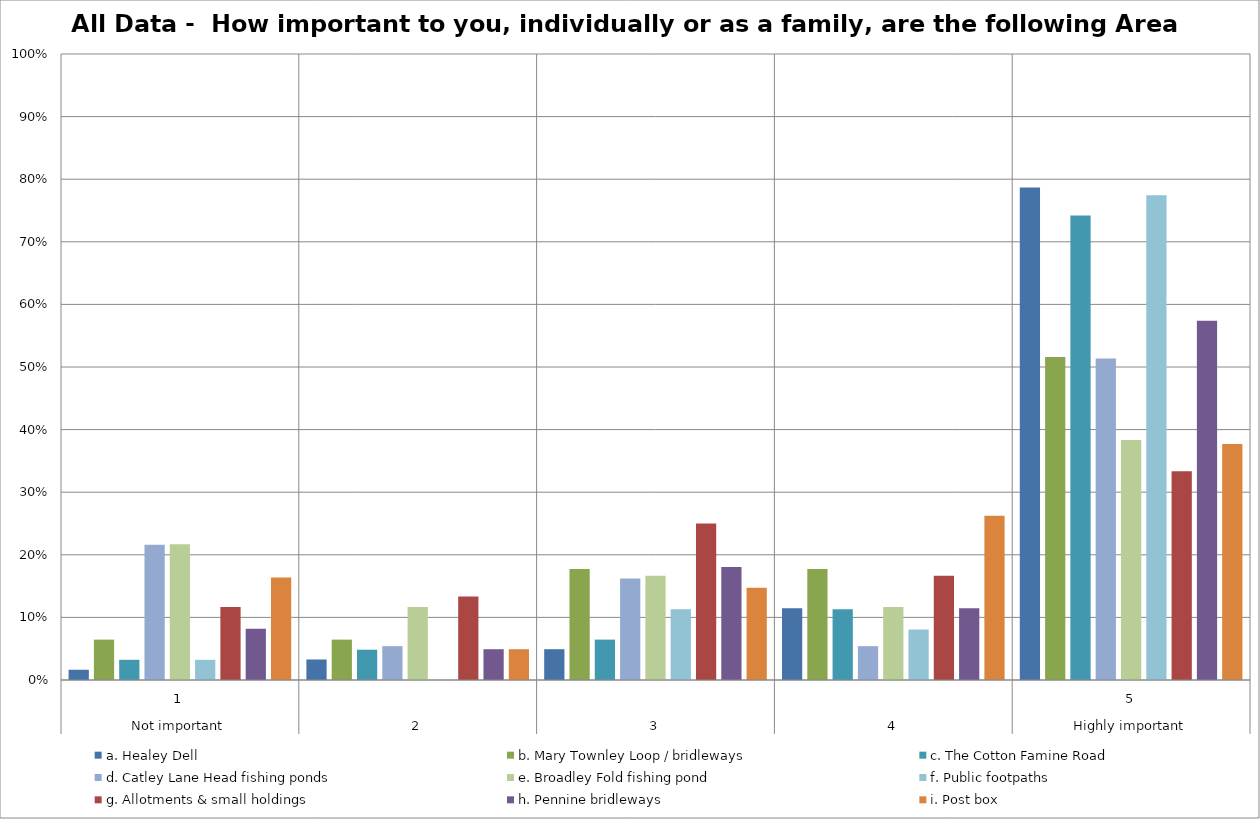
| Category | a. Healey Dell | b. Mary Townley Loop / bridleways | c. The Cotton Famine Road | d. Catley Lane Head fishing ponds | e. Broadley Fold fishing pond | f. Public footpaths | g. Allotments & small holdings | h. Pennine bridleways | i. Post box |
|---|---|---|---|---|---|---|---|---|---|
| 0 | 0.016 | 0.065 | 0.032 | 0.216 | 0.217 | 0.032 | 0.117 | 0.082 | 0.164 |
| 1 | 0.033 | 0.065 | 0.048 | 0.054 | 0.117 | 0 | 0.133 | 0.049 | 0.049 |
| 2 | 0.049 | 0.177 | 0.065 | 0.162 | 0.167 | 0.113 | 0.25 | 0.18 | 0.148 |
| 3 | 0.115 | 0.177 | 0.113 | 0.054 | 0.117 | 0.081 | 0.167 | 0.115 | 0.262 |
| 4 | 0.787 | 0.516 | 0.742 | 0.514 | 0.383 | 0.774 | 0.333 | 0.574 | 0.377 |